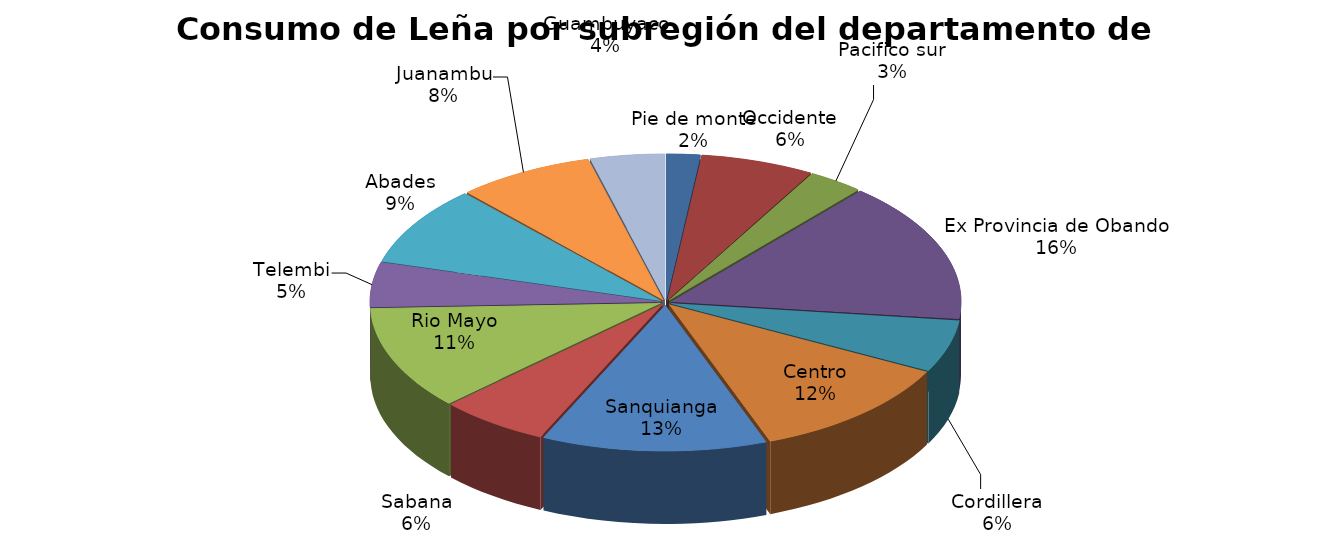
| Category | Series 0 |
|---|---|
| Pie de monte | 0.019 |
| Occidente | 0.063 |
| Pacifico sur | 0.031 |
| Ex Provincia de Obando | 0.156 |
| Cordillera | 0.057 |
| Centro | 0.117 |
| Sanquianga | 0.125 |
| Sabana | 0.061 |
| Rio Mayo | 0.114 |
| Telembi | 0.049 |
| Abades | 0.088 |
| Juanambu | 0.076 |
| Guambuyaco | 0.042 |